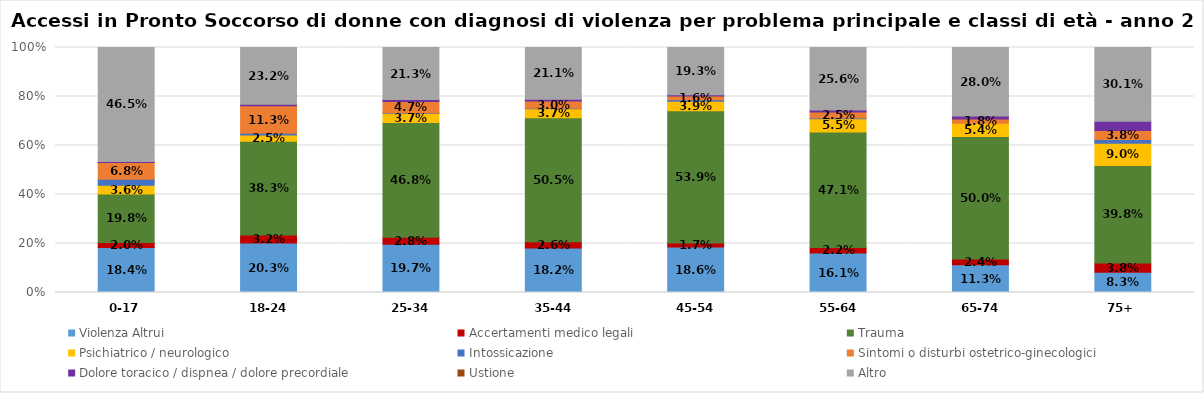
| Category | Violenza Altrui | Accertamenti medico legali | Trauma | Psichiatrico / neurologico | Intossicazione | Sintomi o disturbi ostetrico-ginecologici | Dolore toracico / dispnea / dolore precordiale | Ustione | Altro |
|---|---|---|---|---|---|---|---|---|---|
| 0-17 | 0.184 | 0.02 | 0.198 | 0.036 | 0.024 | 0.068 | 0.004 | 0 | 0.465 |
| 18-24 | 0.203 | 0.032 | 0.383 | 0.025 | 0.007 | 0.113 | 0.006 | 0 | 0.232 |
| 25-34 | 0.197 | 0.028 | 0.468 | 0.037 | 0.002 | 0.047 | 0.008 | 0 | 0.213 |
| 35-44 | 0.182 | 0.026 | 0.505 | 0.037 | 0.002 | 0.03 | 0.007 | 0 | 0.211 |
| 45-54 | 0.186 | 0.017 | 0.539 | 0.039 | 0.005 | 0.016 | 0.005 | 0 | 0.193 |
| 55-64 | 0.161 | 0.022 | 0.471 | 0.055 | 0.002 | 0.025 | 0.007 | 0 | 0.256 |
| 65-74 | 0.113 | 0.024 | 0.5 | 0.054 | 0 | 0.018 | 0.012 | 0 | 0.28 |
| 75+ | 0.083 | 0.038 | 0.398 | 0.09 | 0.015 | 0.038 | 0.038 | 0 | 0.301 |